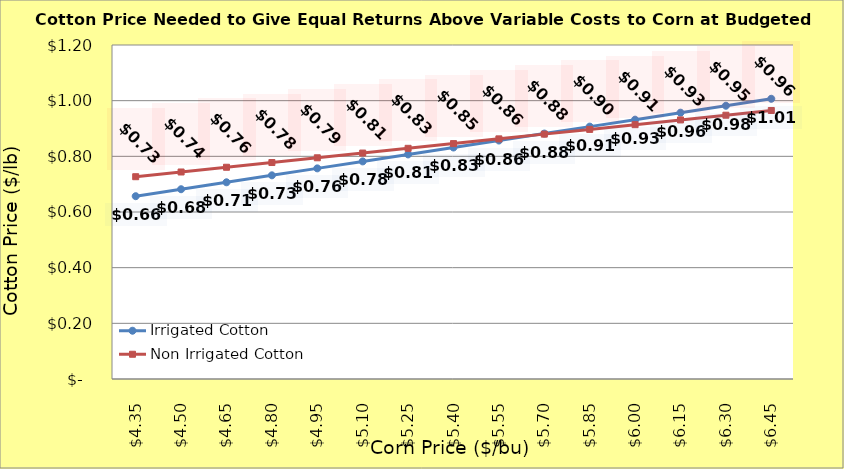
| Category | Irrigated Cotton | Non Irrigated Cotton |
|---|---|---|
| 4.349999999999998 | 0.657 | 0.727 |
| 4.499999999999998 | 0.682 | 0.744 |
| 4.649999999999999 | 0.707 | 0.761 |
| 4.799999999999999 | 0.732 | 0.778 |
| 4.949999999999999 | 0.757 | 0.795 |
| 5.1 | 0.782 | 0.812 |
| 5.25 | 0.807 | 0.829 |
| 5.4 | 0.832 | 0.846 |
| 5.550000000000001 | 0.857 | 0.863 |
| 5.700000000000001 | 0.882 | 0.88 |
| 5.850000000000001 | 0.907 | 0.897 |
| 6.000000000000002 | 0.932 | 0.914 |
| 6.150000000000002 | 0.957 | 0.931 |
| 6.3000000000000025 | 0.982 | 0.948 |
| 6.450000000000003 | 1.007 | 0.965 |